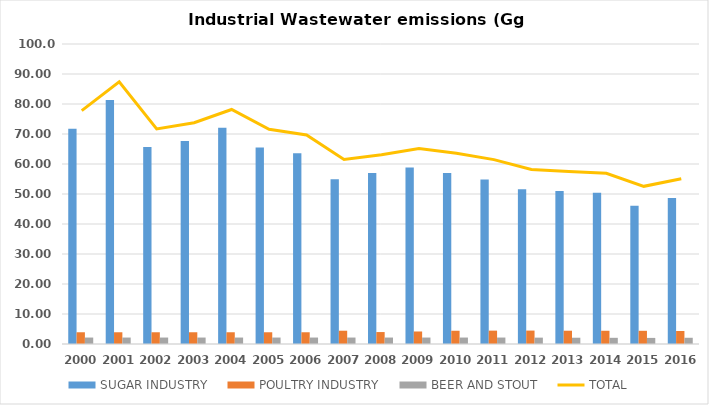
| Category | SUGAR INDUSTRY | POULTRY INDUSTRY | BEER AND STOUT |
|---|---|---|---|
| 2000.0 | 71.73 | 3.914 | 2.151 |
| 2001.0 | 81.345 | 3.914 | 2.151 |
| 2002.0 | 65.632 | 3.914 | 2.151 |
| 2003.0 | 67.682 | 3.914 | 2.151 |
| 2004.0 | 72.112 | 3.914 | 2.151 |
| 2005.0 | 65.497 | 3.914 | 2.151 |
| 2006.0 | 63.612 | 3.914 | 2.151 |
| 2007.0 | 54.932 | 4.428 | 2.151 |
| 2008.0 | 56.96 | 3.982 | 2.151 |
| 2009.0 | 58.871 | 4.172 | 2.151 |
| 2010.0 | 57.012 | 4.418 | 2.151 |
| 2011.0 | 54.849 | 4.456 | 2.151 |
| 2012.0 | 51.559 | 4.475 | 2.121 |
| 2013.0 | 50.994 | 4.428 | 2.091 |
| 2014.0 | 50.422 | 4.414 | 2.062 |
| 2015.0 | 46.125 | 4.399 | 2.032 |
| 2016.0 | 48.671 | 4.343 | 2.076 |